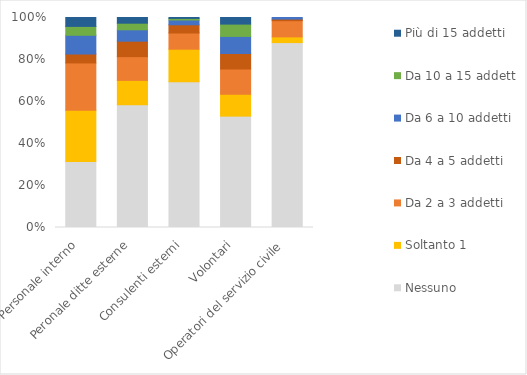
| Category | Nessuno | Soltanto 1 | Da 2 a 3 addetti | Da 4 a 5 addetti | Da 6 a 10 addetti | Da 10 a 15 addetti | Più di 15 addetti |
|---|---|---|---|---|---|---|---|
| Personale interno | 28.9 | 22.5 | 20.7 | 3.9 | 8.2 | 3.9 | 3.9 |
| Peronale ditte esterne | 53.9 | 10.7 | 10.4 | 6.8 | 5 | 2.9 | 2.5 |
| Consulenti esterni | 63.9 | 14.3 | 7.1 | 3.6 | 2.1 | 0.7 | 0.4 |
| Volontari | 48.9 | 9.6 | 11.1 | 6.8 | 7.5 | 5.4 | 2.9 |
| Operatori del servizio civile | 81.1 | 2.5 | 7.1 | 0.7 | 0.7 | 0 | 0 |